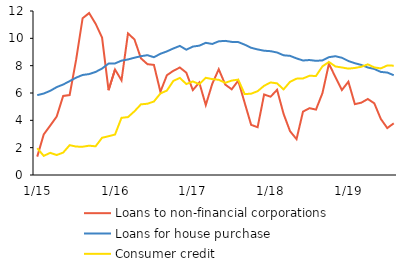
| Category | Loans to non-financial corporations | Loans for house purchase | Consumer credit |
|---|---|---|---|
|  1/15 | 1.344 | 5.84 | 1.96 |
| 2 | 2.969 | 5.96 | 1.4 |
| 3 | 3.615 | 6.159 | 1.62 |
| 4 | 4.281 | 6.43 | 1.462 |
| 5 | 5.782 | 6.62 | 1.639 |
| 6 | 5.853 | 6.869 | 2.183 |
| 7 | 8.437 | 7.124 | 2.08 |
| 8 | 11.475 | 7.318 | 2.069 |
| 9 | 11.846 | 7.384 | 2.145 |
| 10 | 11.075 | 7.54 | 2.098 |
| 11 | 10.058 | 7.79 | 2.724 |
| 12 | 6.204 | 8.153 | 2.838 |
|  1/16 | 7.719 | 8.163 | 2.96 |
| 2 | 6.928 | 8.368 | 4.184 |
| 3 | 10.362 | 8.454 | 4.237 |
| 4 | 9.918 | 8.583 | 4.663 |
| 5 | 8.537 | 8.692 | 5.171 |
| 6 | 8.109 | 8.768 | 5.214 |
| 7 | 8.057 | 8.617 | 5.377 |
| 8 | 6.09 | 8.871 | 5.965 |
| 9 | 7.299 | 9.044 | 6.179 |
| 10 | 7.625 | 9.26 | 6.887 |
| 11 | 7.866 | 9.446 | 7.103 |
| 12 | 7.485 | 9.166 | 6.655 |
|  1/17 | 6.213 | 9.397 | 6.847 |
| 1/00 | 6.765 | 9.463 | 6.648 |
| 3 | 5.115 | 9.671 | 7.111 |
| 4 | 6.673 | 9.588 | 7.018 |
| 5 | 7.74 | 9.782 | 6.965 |
| 6 | 6.618 | 9.815 | 6.745 |
| 7 | 6.269 | 9.74 | 6.909 |
| 8 | 6.902 | 9.729 | 6.978 |
| 9 | 5.281 | 9.537 | 5.921 |
| 10 | 3.669 | 9.308 | 5.949 |
| 11 | 3.496 | 9.188 | 6.133 |
| 12 | 5.891 | 9.094 | 6.528 |
|  1/18 | 5.728 | 9.059 | 6.772 |
| 2 | 6.234 | 8.964 | 6.704 |
| 3 | 4.475 | 8.76 | 6.263 |
| 4 | 3.204 | 8.718 | 6.82 |
| 5 | 2.625 | 8.532 | 7.051 |
| 6 | 4.638 | 8.379 | 7.065 |
| 7 | 4.89 | 8.413 | 7.26 |
| 8 | 4.785 | 8.355 | 7.247 |
| 9 | 5.993 | 8.384 | 7.95 |
| 10 | 8.137 | 8.622 | 8.271 |
| 11 | 7.165 | 8.691 | 7.942 |
| 12 | 6.217 | 8.578 | 7.867 |
|  1/19 | 6.825 | 8.341 | 7.783 |
| 2 | 5.184 | 8.179 | 7.832 |
| 3 | 5.293 | 8.052 | 7.921 |
| 4 | 5.561 | 7.865 | 8.096 |
| 5 | 5.245 | 7.758 | 7.872 |
| 6 | 4.106 | 7.542 | 7.8 |
| 7 | 3.433 | 7.497 | 8.014 |
| 8 | 3.782 | 7.3 | 8 |